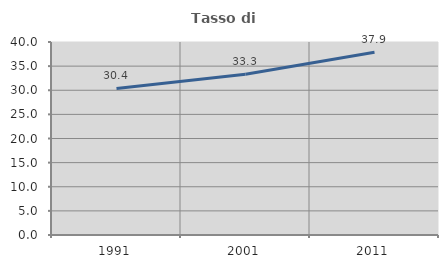
| Category | Tasso di occupazione   |
|---|---|
| 1991.0 | 30.386 |
| 2001.0 | 33.308 |
| 2011.0 | 37.895 |